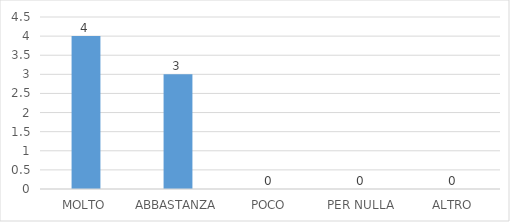
| Category | Series 0 |
|---|---|
| MOLTO | 4 |
| ABBASTANZA | 3 |
| POCO | 0 |
| PER NULLA | 0 |
| ALTRO | 0 |